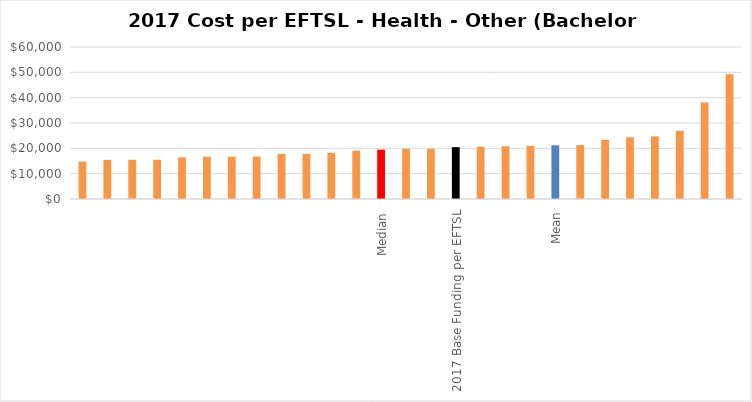
| Category | Series 0 |
|---|---|
|  | 14768.629 |
|  | 15433.987 |
|  | 15479.688 |
|  | 15505.495 |
|  | 16419.488 |
|  | 16674.603 |
|  | 16724.28 |
|  | 16779.959 |
|  | 17745.185 |
|  | 17820.162 |
|  | 18240.056 |
|  | 19098.044 |
| Median | 19471.533 |
|  | 19791.514 |
|  | 19822.257 |
| 2017 Base Funding per EFTSL | 20461.743 |
|  | 20638.31 |
|  | 20858.516 |
|  | 20939.081 |
| Mean | 21211 |